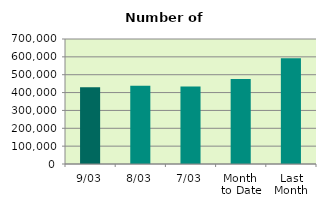
| Category | Series 0 |
|---|---|
| 9/03 | 430140 |
| 8/03 | 438472 |
| 7/03 | 433392 |
| Month 
to Date | 476116.857 |
| Last
Month | 592303 |